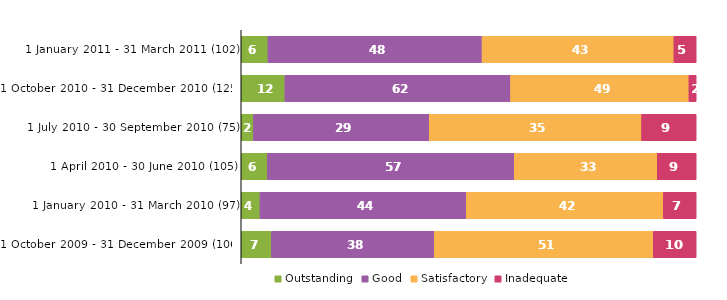
| Category | Outstanding | Good | Satisfactory | Inadequate |
|---|---|---|---|---|
| 1 January 2011 - 31 March 2011 (102) | 6 | 48 | 43 | 5 |
| 1 October 2010 - 31 December 2010 (125) | 12 | 62 | 49 | 2 |
| 1 July 2010 - 30 September 2010 (75) | 2 | 29 | 35 | 9 |
| 1 April 2010 - 30 June 2010 (105) | 6 | 57 | 33 | 9 |
| 1 January 2010 - 31 March 2010 (97) | 4 | 44 | 42 | 7 |
| 1 October 2009 - 31 December 2009 (106) | 7 | 38 | 51 | 10 |